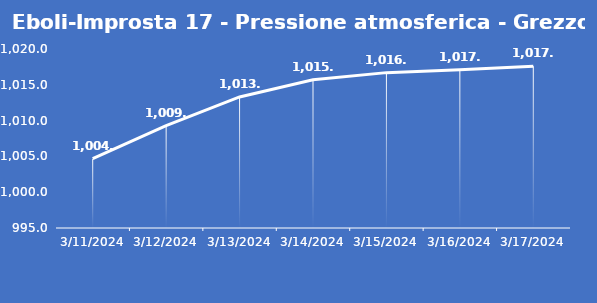
| Category | Eboli-Improsta 17 - Pressione atmosferica - Grezzo (hPa) |
|---|---|
| 3/11/24 | 1004.7 |
| 3/12/24 | 1009.3 |
| 3/13/24 | 1013.3 |
| 3/14/24 | 1015.7 |
| 3/15/24 | 1016.7 |
| 3/16/24 | 1017.1 |
| 3/17/24 | 1017.6 |